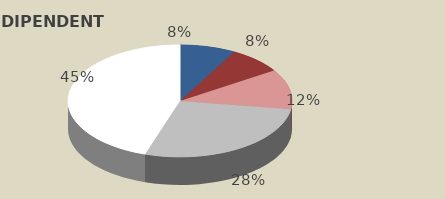
| Category | Series 0 |
|---|---|
| fino a 2 anni | 7319 |
| da 3 a 5 anni | 7138 |
| da 6 a 9 anni | 10558 |
| da 10 a 20 anni | 25241 |
| oltre 20 anni | 41073 |